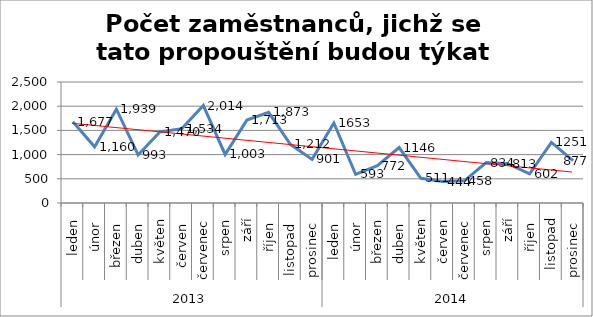
| Category | počet zaměstnanců, jichž se tato propouštění budou týkat   |
|---|---|
| 0 | 1677 |
| 1 | 1160 |
| 2 | 1939 |
| 3 | 993 |
| 4 | 1470 |
| 5 | 1534 |
| 6 | 2014 |
| 7 | 1003 |
| 8 | 1713 |
| 9 | 1873 |
| 10 | 1212 |
| 11 | 901 |
| 12 | 1653 |
| 13 | 593 |
| 14 | 772 |
| 15 | 1146 |
| 16 | 511 |
| 17 | 444 |
| 18 | 458 |
| 19 | 834 |
| 20 | 813 |
| 21 | 602 |
| 22 | 1251 |
| 23 | 877 |